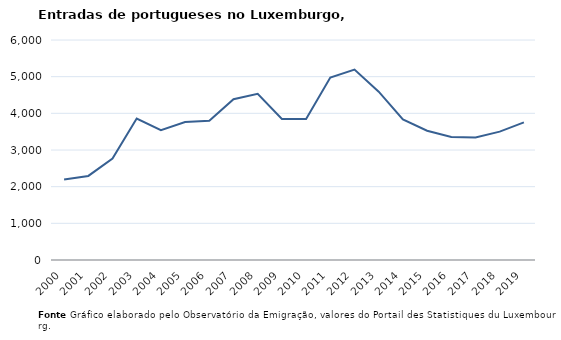
| Category | Entradas |
|---|---|
| 2000.0 | 2193 |
| 2001.0 | 2293 |
| 2002.0 | 2767 |
| 2003.0 | 3857 |
| 2004.0 | 3542 |
| 2005.0 | 3761 |
| 2006.0 | 3796 |
| 2007.0 | 4385 |
| 2008.0 | 4531 |
| 2009.0 | 3844 |
| 2010.0 | 3845 |
| 2011.0 | 4977 |
| 2012.0 | 5193 |
| 2013.0 | 4590 |
| 2014.0 | 3832 |
| 2015.0 | 3525 |
| 2016.0 | 3355 |
| 2017.0 | 3342 |
| 2018.0 | 3501 |
| 2019.0 | 3752 |